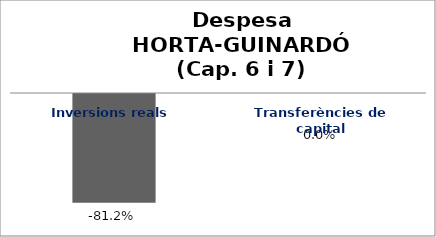
| Category | Series 0 |
|---|---|
| Inversions reals | -0.812 |
| Transferències de capital | 0 |